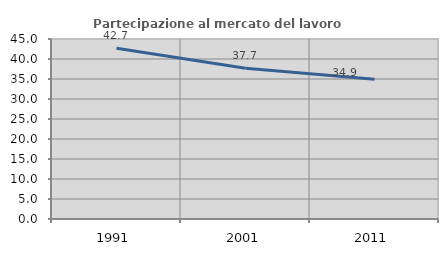
| Category | Partecipazione al mercato del lavoro  femminile |
|---|---|
| 1991.0 | 42.685 |
| 2001.0 | 37.701 |
| 2011.0 | 34.93 |